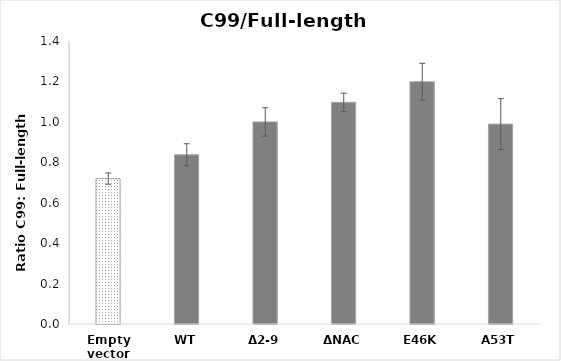
| Category | Series 0 |
|---|---|
| Empty vector | 0.719 |
| WT | 0.837 |
| Δ2-9 | 1 |
| ΔNAC | 1.097 |
| E46K | 1.198 |
| A53T | 0.989 |